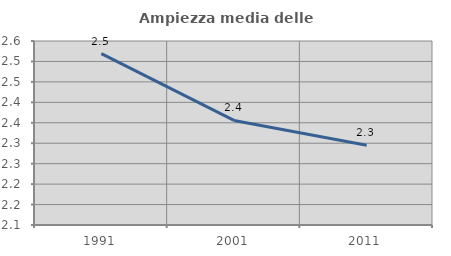
| Category | Ampiezza media delle famiglie |
|---|---|
| 1991.0 | 2.519 |
| 2001.0 | 2.356 |
| 2011.0 | 2.295 |